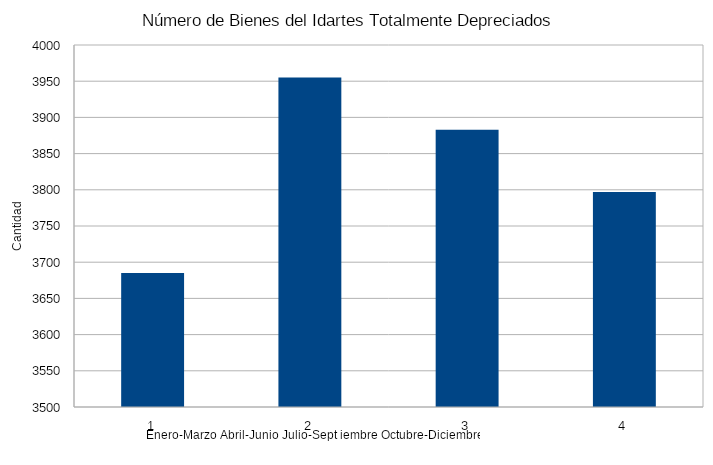
| Category | Series 0 |
|---|---|
| 0 | 3685 |
| 1 | 3955 |
| 2 | 3883 |
| 3 | 3797 |